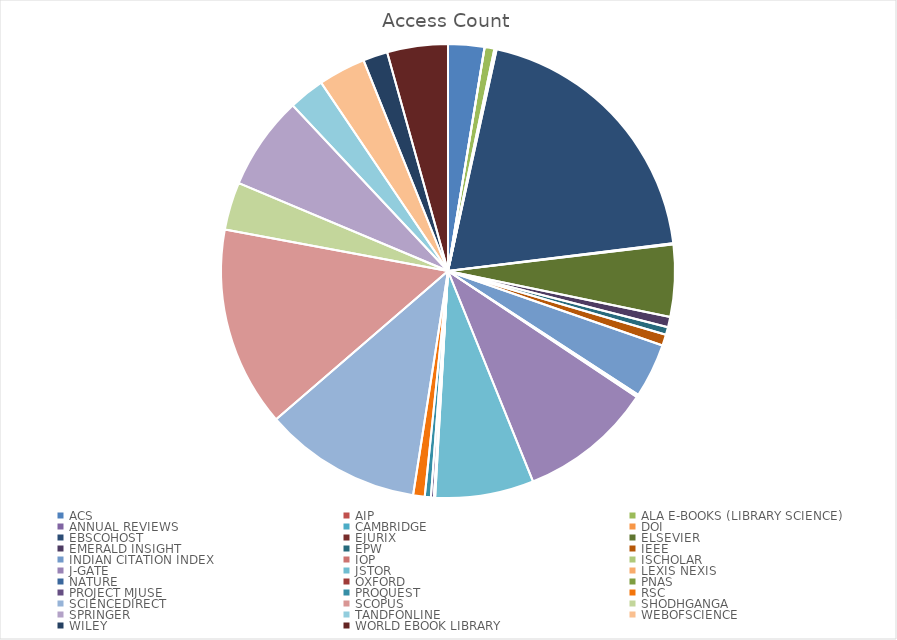
| Category | Access Count |
|---|---|
| ACS | 936 |
| AIP | 3 |
| ALA E-BOOKS (LIBRARY SCIENCE) | 252 |
| ANNUAL REVIEWS | 24 |
| CAMBRIDGE | 9 |
| DOI | 25 |
| EBSCOHOST | 7121 |
| EJURIX | 29 |
| ELSEVIER | 1860 |
| EMERALD INSIGHT | 265 |
| EPW | 198 |
| IEEE | 289 |
| INDIAN CITATION INDEX | 1400 |
| IOP | 38 |
| ISCHOLAR | 31 |
| J-GATE | 3459 |
| JSTOR | 2546 |
| LEXIS NEXIS | 14 |
| NATURE | 3 |
| OXFORD | 12 |
| PNAS | 2 |
| PROJECT MJUSE | 78 |
| PROQUEST | 158 |
| RSC | 299 |
| SCIENCEDIRECT | 4070 |
| SCOPUS | 5177 |
| SHODHGANGA | 1237 |
| SPRINGER | 2426 |
| TANDFONLINE | 927 |
| WEBOFSCIENCE | 1224 |
| WILEY | 634 |
| WORLD EBOOK LIBRARY | 1569 |